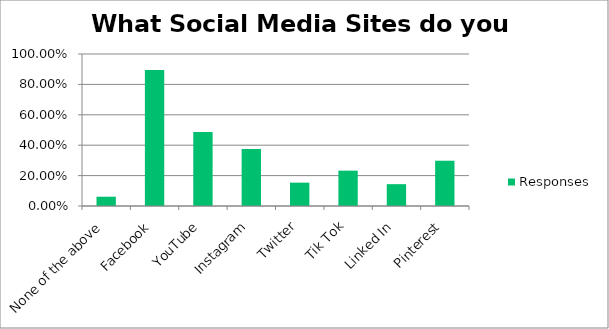
| Category | Responses |
|---|---|
| None of the above | 0.061 |
| Facebook | 0.895 |
| YouTube | 0.487 |
| Instagram | 0.374 |
| Twitter | 0.154 |
| Tik Tok | 0.233 |
| Linked In | 0.144 |
| Pinterest | 0.298 |